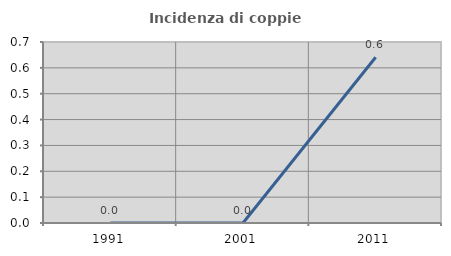
| Category | Incidenza di coppie miste |
|---|---|
| 1991.0 | 0 |
| 2001.0 | 0 |
| 2011.0 | 0.641 |